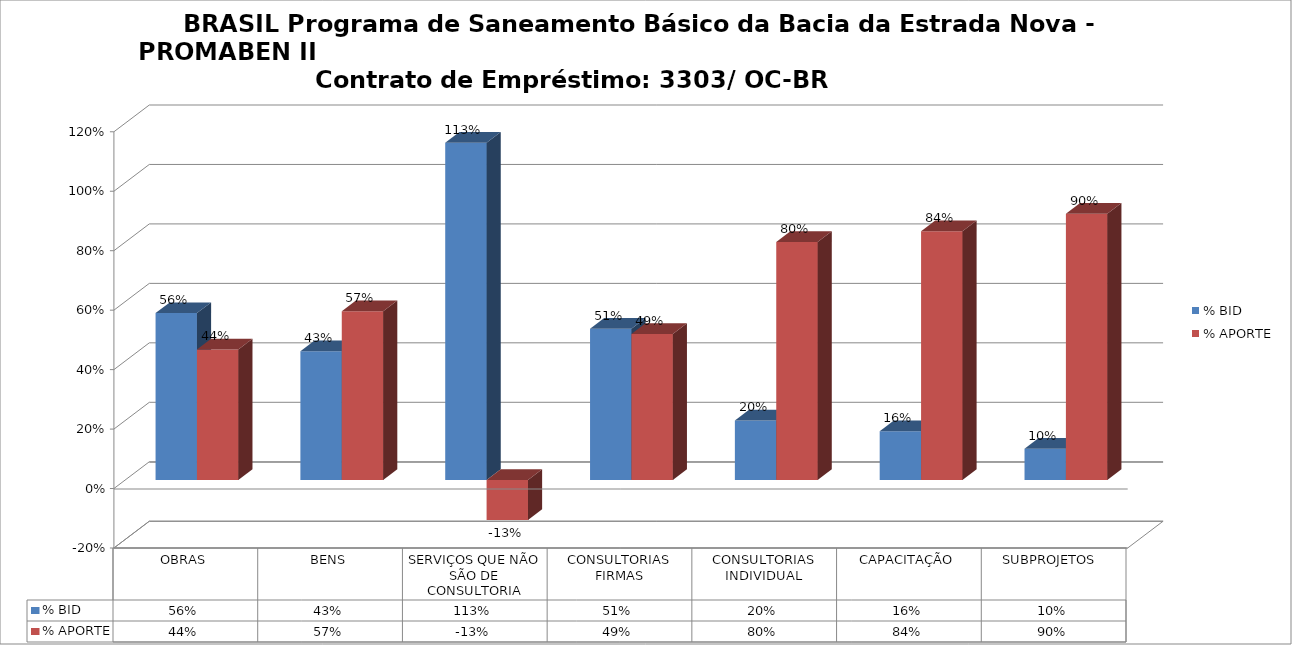
| Category | % BID | % APORTE |
|---|---|---|
| OBRAS | 0.561 | 0.439 |
| BENS | 0.433 | 0.567 |
| SERVIÇOS QUE NÃO SÃO DE CONSULTORIA | 1.134 | -0.134 |
| CONSULTORIAS FIRMAS | 0.509 | 0.491 |
| CONSULTORIAS INDIVIDUAL | 0.2 | 0.8 |
| CAPACITAÇÃO | 0.164 | 0.836 |
| SUBPROJETOS  | 0.105 | 0.895 |